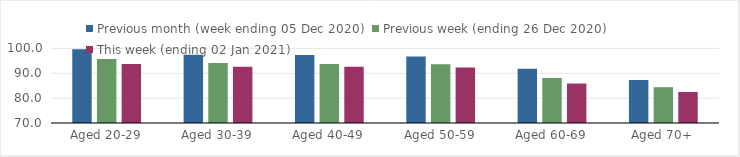
| Category | Previous month (week ending 05 Dec 2020) | Previous week (ending 26 Dec 2020) | This week (ending 02 Jan 2021) |
|---|---|---|---|
| Aged 20-29 | 99.69 | 95.77 | 93.72 |
| Aged 30-39 | 97.44 | 94.09 | 92.58 |
| Aged 40-49 | 97.32 | 93.73 | 92.63 |
| Aged 50-59 | 96.72 | 93.66 | 92.33 |
| Aged 60-69 | 91.86 | 88.1 | 85.88 |
| Aged 70+ | 87.25 | 84.41 | 82.47 |